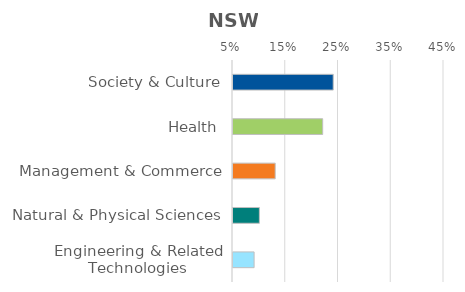
| Category | Series 0 |
|---|---|
| Society & Culture | 0.24 |
| Health | 0.22 |
| Management & Commerce | 0.13 |
| Natural & Physical Sciences | 0.1 |
| Engineering & Related Technologies | 0.09 |